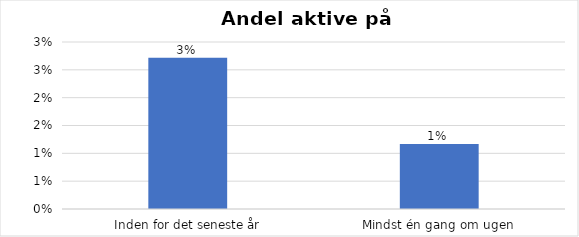
| Category | % |
|---|---|
| Inden for det seneste år | 0.027 |
| Mindst én gang om ugen | 0.012 |